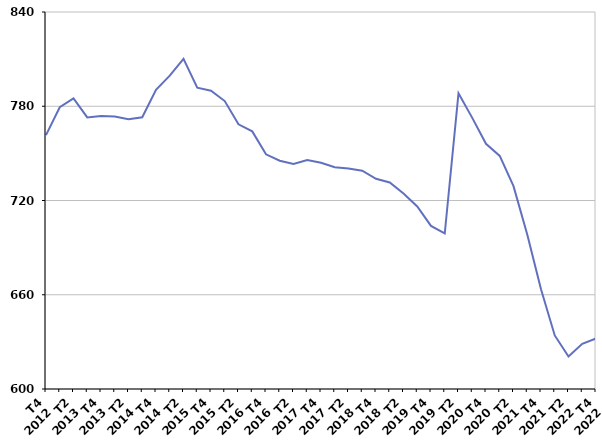
| Category | Moins de 25 ans |
|---|---|
| T4
2012 | 761.6 |
| T1
2013 | 779.4 |
| T2
2013 | 785 |
| T3
2013 | 772.9 |
| T4
2013 | 773.8 |
| T1
2014 | 773.5 |
| T2
2014 | 771.7 |
| T3
2014 | 773 |
| T4
2014 | 790.5 |
| T1
2015 | 799.5 |
| T2
2015 | 810.2 |
| T3
2015 | 791.8 |
| T4
2015 | 789.9 |
| T1
2016 | 783.3 |
| T2
2016 | 768.5 |
| T3
2016 | 764 |
| T4
2016 | 749.4 |
| T1
2017 | 745.3 |
| T2
2017 | 743.2 |
| T3
2017 | 745.8 |
| T4
2017 | 744 |
| T1
2018 | 741.2 |
| T2
2018 | 740.4 |
| T3
2018 | 739 |
| T4
2018 | 733.8 |
| T1
2019 | 731.5 |
| T2
2019 | 724.5 |
| T3
2019 | 716.2 |
| T4
2019 | 703.8 |
| T1
2020 | 699 |
| T2
2020 | 788.3 |
| T3
2020 | 772.6 |
| T4
2020 | 756.1 |
| T1
2021 | 748.4 |
| T2
2021 | 729.1 |
| T3
2021 | 698.4 |
| T4
2021 | 663.5 |
| T1
2022 | 634.1 |
| T2
2022 | 620.7 |
| T3
2022 | 628.8 |
| T4
2022 | 632.2 |